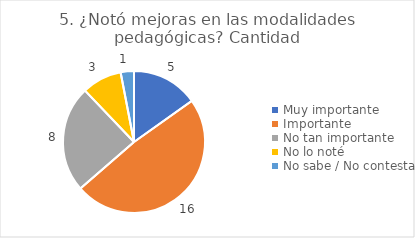
| Category | 5. ¿Notó mejoras en las modalidades pedagógicas? |
|---|---|
| Muy importante  | 0.152 |
| Importante  | 0.485 |
| No tan importante  | 0.242 |
| No lo noté  | 0.091 |
| No sabe / No contesta | 0.03 |